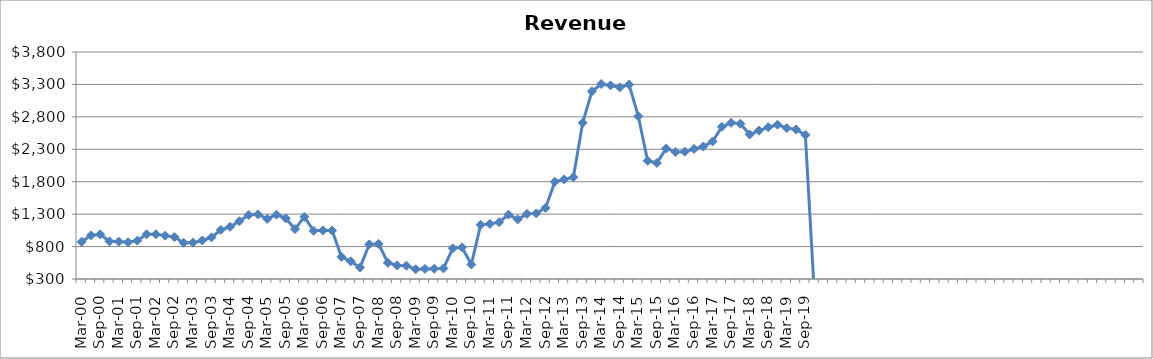
| Category | Revenue ($Millions) |
|---|---|
| Mar-00 | 874.123 |
| Jun-00 | 973.182 |
| Sep-00 | 987.414 |
| Dec-00 | 879.758 |
| Mar-01 | 876.392 |
| Jun-01 | 868.05 |
| Sep-01 | 891.708 |
| Dec-01 | 989.918 |
| Mar-02 | 989.729 |
| Jun-02 | 968.152 |
| Sep-02 | 946.427 |
| Dec-02 | 858.054 |
| Mar-03 | 859.904 |
| Jun-03 | 893.933 |
| Sep-03 | 941.43 |
| Dec-03 | 1056.874 |
| Mar-04 | 1104.567 |
| Jun-04 | 1189.089 |
| Sep-04 | 1287.4 |
| Dec-04 | 1297.2 |
| Mar-05 | 1226.464 |
| Jun-05 | 1291.9 |
| Sep-05 | 1234.66 |
| Dec-05 | 1069.816 |
| Mar-06 | 1257.13 |
| Jun-06 | 1042.982 |
| Sep-06 | 1049.474 |
| Dec-06 | 1046.858 |
| Mar-07 | 640.986 |
| Jun-07 | 572.274 |
| Sep-07 | 476.87 |
| Dec-07 | 833.564 |
| Mar-08 | 841.602 |
| Jun-08 | 550.119 |
| Sep-08 | 509.405 |
| Dec-08 | 505.522 |
| Mar-09 | 450.198 |
| Jun-09 | 455.312 |
| Sep-09 | 458.554 |
| Dec-09 | 463.342 |
| Mar-10 | 773.412 |
| Jun-10 | 788.212 |
| Sep-10 | 523.292 |
| Dec-10 | 1135.723 |
| Mar-11 | 1149.992 |
| Jun-11 | 1175.5 |
| Sep-11 | 1292.506 |
| Dec-11 | 1218.506 |
| Mar-12 | 1302.694 |
| Jun-12 | 1311.536 |
| Sep-12 | 1396.2 |
| Dec-12 | 1798.682 |
| Mar-13 | 1835.934 |
| Jun-13 | 1868.73 |
| Sep-13 | 2709.177 |
| Dec-13 | 3194.3 |
| Mar-14 | 3306.474 |
| Jun-14 | 3285.173 |
| Sep-14 | 3254.7 |
| Dec-14 | 3297.6 |
| Mar-15 | 2808.5 |
| Jun-15 | 2123.074 |
| Sep-15 | 2088.928 |
| Dec-15 | 2313.124 |
| Mar-16 | 2257.423 |
| Jun-16 | 2263.656 |
| Sep-16 | 2305.333 |
| Dec-16 | 2342.95 |
| Mar-17 | 2420.5 |
| Jun-17 | 2646.1 |
| Sep-17 | 2707.8 |
| Dec-17 | 2693.7 |
| Mar-18 | 2527.86 |
| Jun-18 | 2588.354 |
| Sep-18 | 2640.761 |
| Dec-18 | 2679.008 |
| Mar-19 | 2627.456 |
| Jun-19 | 2605.722 |
| Sep-19 | 2520.344 |